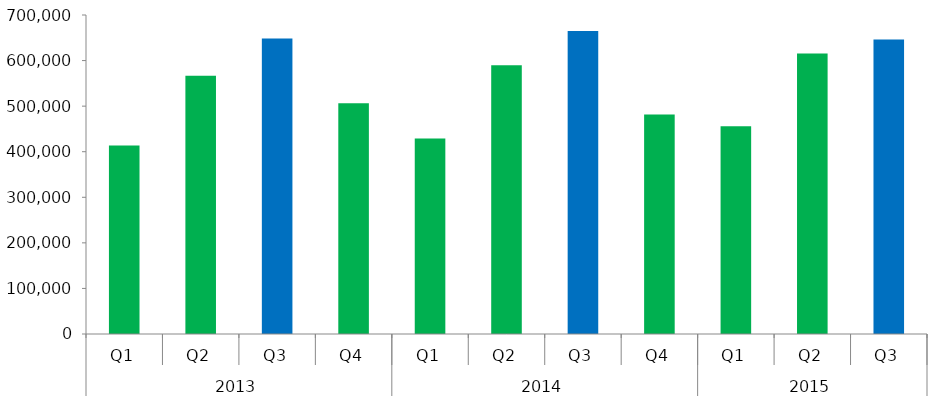
| Category | Series 0 |
|---|---|
| 0 | 413723.023 |
| 1 | 566647.88 |
| 2 | 648538.622 |
| 3 | 506562.556 |
| 4 | 429036.451 |
| 5 | 589845.181 |
| 6 | 664715.139 |
| 7 | 481640.263 |
| 8 | 455997.023 |
| 9 | 615438.861 |
| 10 | 646504.846 |